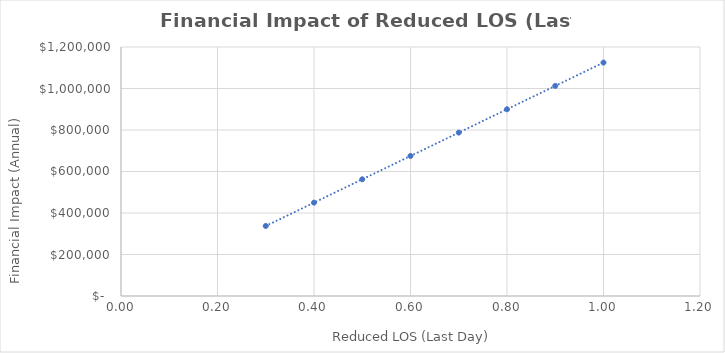
| Category | Series 0 |
|---|---|
| 0.3 | 337500 |
| 0.4 | 450000 |
| 0.5 | 562500 |
| 0.6 | 675000 |
| 0.7 | 787500 |
| 0.8 | 900000 |
| 0.9 | 1012500 |
| 1.0 | 1125000 |